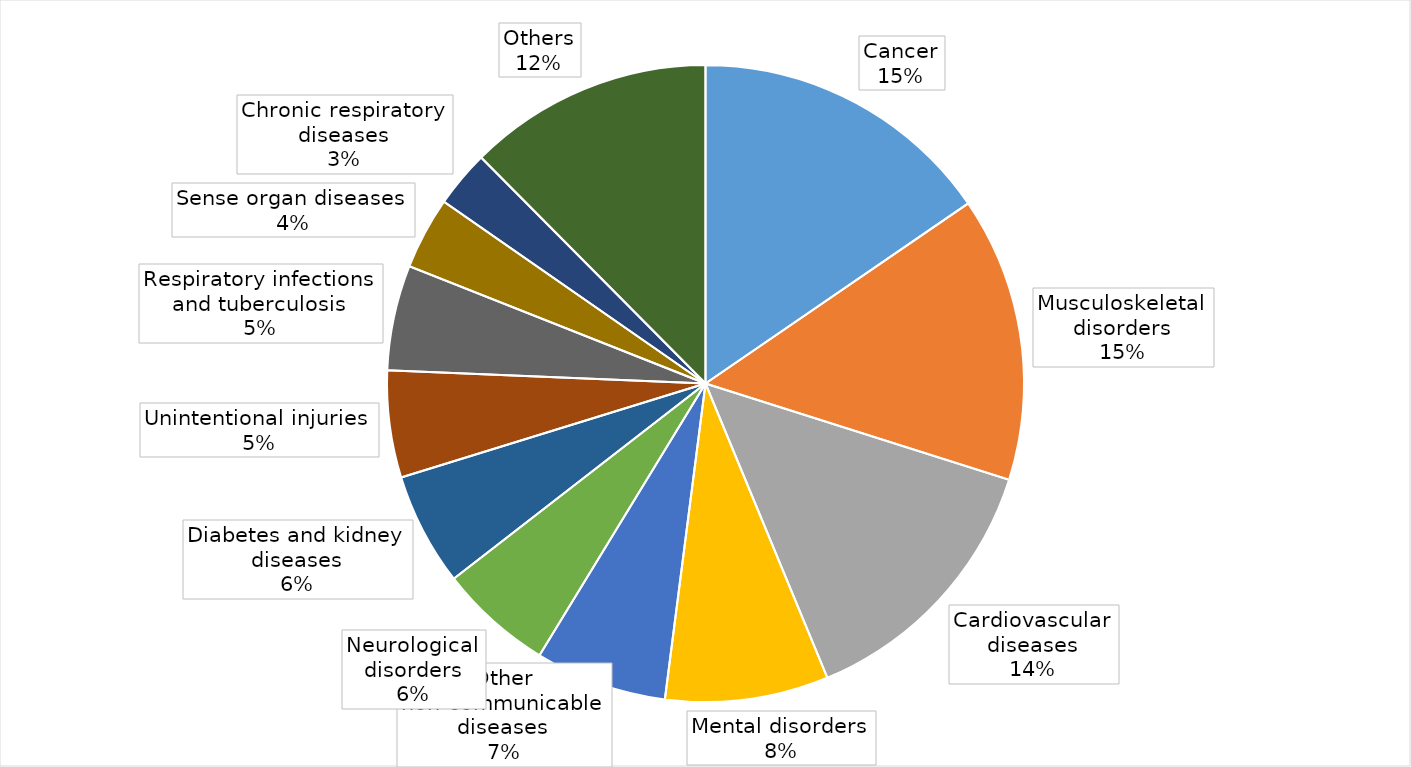
| Category | Series 0 |
|---|---|
| Cancer | 0.176 |
| Musculoskeletal disorders | 0.165 |
| Cardiovascular diseases | 0.158 |
| Mental disorders | 0.095 |
| Other non-communicable diseases | 0.076 |
| Neurological disorders | 0.066 |
| Diabetes and kidney diseases | 0.065 |
| Unintentional injuries | 0.062 |
| Respiratory infections and tuberculosis | 0.061 |
| Sense organ diseases | 0.042 |
| Chronic respiratory diseases | 0.033 |
| Others | 0.142 |